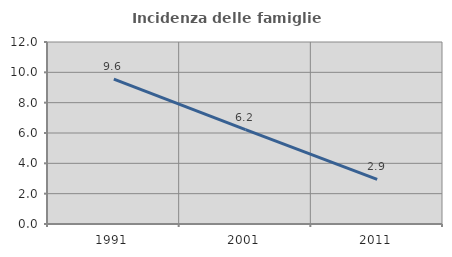
| Category | Incidenza delle famiglie numerose |
|---|---|
| 1991.0 | 9.551 |
| 2001.0 | 6.22 |
| 2011.0 | 2.948 |